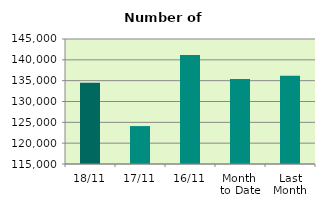
| Category | Series 0 |
|---|---|
| 18/11 | 134510 |
| 17/11 | 124104 |
| 16/11 | 141152 |
| Month 
to Date | 135384.857 |
| Last
Month | 136171.238 |